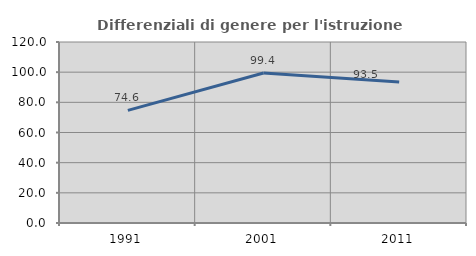
| Category | Differenziali di genere per l'istruzione superiore |
|---|---|
| 1991.0 | 74.644 |
| 2001.0 | 99.408 |
| 2011.0 | 93.483 |